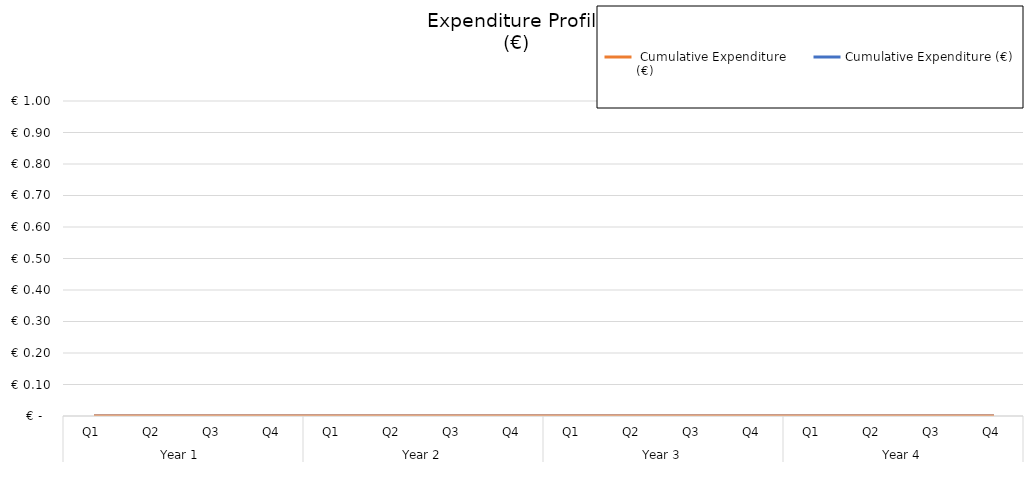
| Category | Cumulative Expenditure (€) |  Cumulative Expenditure 
(€) |
|---|---|---|
| 0 | 0 | 0 |
| 1 | 0 | 0 |
| 2 | 0 | 0 |
| 3 | 0 | 0 |
| 4 | 0 | 0 |
| 5 | 0 | 0 |
| 6 | 0 | 0 |
| 7 | 0 | 0 |
| 8 | 0 | 0 |
| 9 | 0 | 0 |
| 10 | 0 | 0 |
| 11 | 0 | 0 |
| 12 | 0 | 0 |
| 13 | 0 | 0 |
| 14 | 0 | 0 |
| 15 | 0 | 0 |